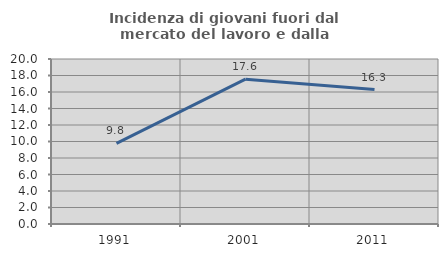
| Category | Incidenza di giovani fuori dal mercato del lavoro e dalla formazione  |
|---|---|
| 1991.0 | 9.762 |
| 2001.0 | 17.556 |
| 2011.0 | 16.295 |